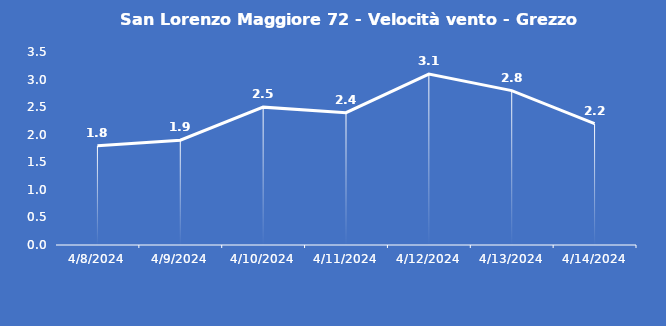
| Category | San Lorenzo Maggiore 72 - Velocità vento - Grezzo (m/s) |
|---|---|
| 4/8/24 | 1.8 |
| 4/9/24 | 1.9 |
| 4/10/24 | 2.5 |
| 4/11/24 | 2.4 |
| 4/12/24 | 3.1 |
| 4/13/24 | 2.8 |
| 4/14/24 | 2.2 |